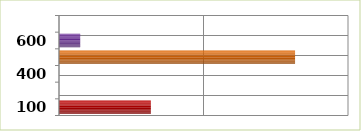
| Category | Series 0 |
|---|---|
| 100.0 | 63563342 |
| 200.0 | 0 |
| 400.0 | 0 |
| 500.0 | 163366020 |
| 600.0 | 14679546 |
| 700.0 | 0 |